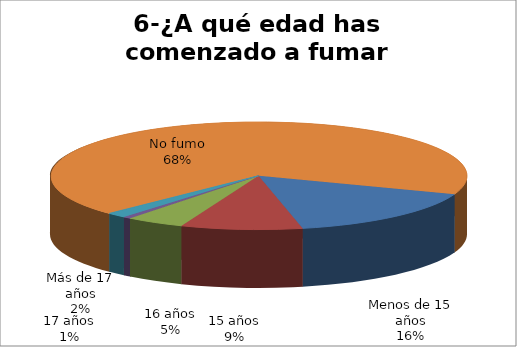
| Category | Series 0 |
|---|---|
| Menos de 15 años | 53 |
| 15 años | 31 |
| 16 años | 15 |
| 17 años | 2 |
| Más de 17 años | 5 |
| No fumo | 224 |